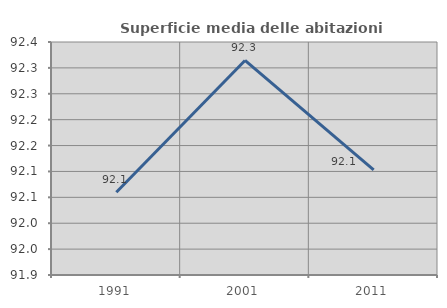
| Category | Superficie media delle abitazioni occupate |
|---|---|
| 1991.0 | 92.06 |
| 2001.0 | 92.314 |
| 2011.0 | 92.103 |